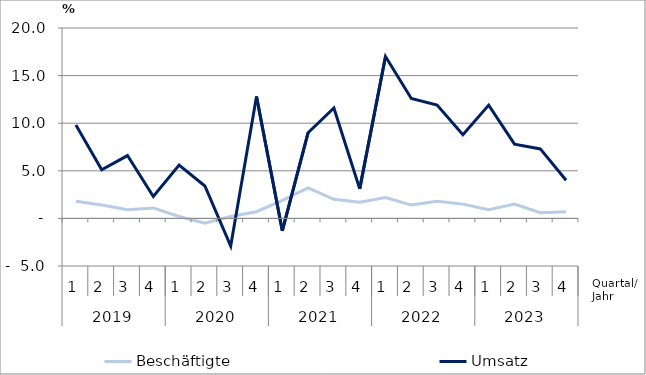
| Category | Beschäftigte | Umsatz |
|---|---|---|
| 0 | 1.8 | 9.8 |
| 1 | 1.4 | 5.1 |
| 2 | 0.9 | 6.6 |
| 3 | 1.1 | 2.3 |
| 4 | 0.2 | 5.6 |
| 5 | -0.5 | 3.4 |
| 6 | 0.2 | -2.9 |
| 7 | 0.7 | 12.8 |
| 8 | 1.9 | -1.3 |
| 9 | 3.2 | 9 |
| 10 | 2 | 11.6 |
| 11 | 1.7 | 3.1 |
| 12 | 2.2 | 17 |
| 13 | 1.4 | 12.6 |
| 14 | 1.8 | 11.9 |
| 15 | 1.5 | 8.8 |
| 16 | 0.9 | 11.9 |
| 17 | 1.5 | 7.8 |
| 18 | 0.6 | 7.3 |
| 19 | 0.7 | 4 |